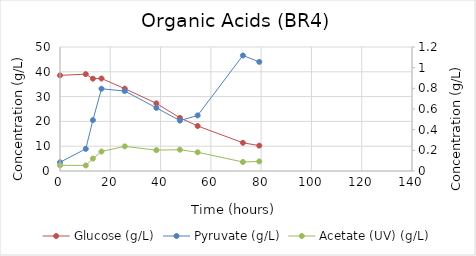
| Category | Glucose (g/L) |
|---|---|
| 0.0 | 38.574 |
| 10.250000000058208 | 39.058 |
| 13.083333333372138 | 37.229 |
| 16.5 | 37.315 |
| 25.749999999941792 | 33.208 |
| 38.33333333325572 | 27.278 |
| 47.683333333348855 | 21.421 |
| 54.75 | 18.154 |
| 72.75 | 11.374 |
| 79.25000000005821 | 10.233 |